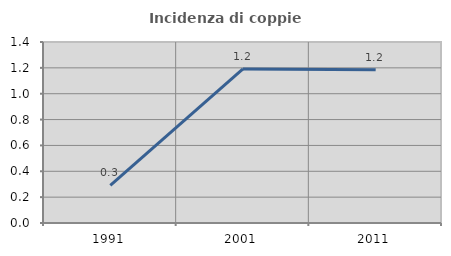
| Category | Incidenza di coppie miste |
|---|---|
| 1991.0 | 0.29 |
| 2001.0 | 1.191 |
| 2011.0 | 1.185 |